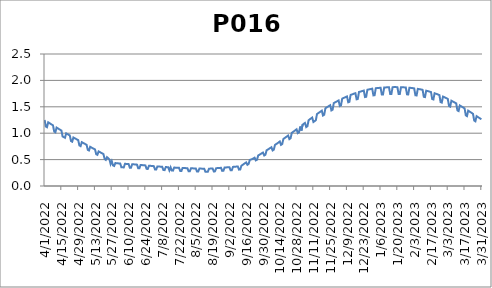
| Category | P016 |
|---|---|
| 4/1/22 | 1.251 |
| 4/2/22 | 1.127 |
| 4/3/22 | 1.114 |
| 4/4/22 | 1.207 |
| 4/5/22 | 1.192 |
| 4/6/22 | 1.177 |
| 4/7/22 | 1.163 |
| 4/8/22 | 1.149 |
| 4/9/22 | 1.03 |
| 4/10/22 | 1.017 |
| 4/11/22 | 1.107 |
| 4/12/22 | 1.092 |
| 4/13/22 | 1.078 |
| 4/14/22 | 1.065 |
| 4/15/22 | 1.051 |
| 4/16/22 | 0.938 |
| 4/17/22 | 0.925 |
| 4/18/22 | 0.913 |
| 4/19/22 | 0.997 |
| 4/20/22 | 0.984 |
| 4/21/22 | 0.97 |
| 4/22/22 | 0.958 |
| 4/23/22 | 0.851 |
| 4/24/22 | 0.839 |
| 4/25/22 | 0.919 |
| 4/26/22 | 0.906 |
| 4/27/22 | 0.893 |
| 4/28/22 | 0.881 |
| 4/29/22 | 0.869 |
| 4/30/22 | 0.768 |
| 5/1/22 | 0.755 |
| 5/2/22 | 0.83 |
| 5/3/22 | 0.818 |
| 5/4/22 | 0.805 |
| 5/5/22 | 0.793 |
| 5/6/22 | 0.78 |
| 5/7/22 | 0.684 |
| 5/8/22 | 0.672 |
| 5/9/22 | 0.742 |
| 5/10/22 | 0.729 |
| 5/11/22 | 0.717 |
| 5/12/22 | 0.705 |
| 5/13/22 | 0.692 |
| 5/14/22 | 0.602 |
| 5/15/22 | 0.59 |
| 5/16/22 | 0.655 |
| 5/17/22 | 0.643 |
| 5/18/22 | 0.63 |
| 5/19/22 | 0.618 |
| 5/20/22 | 0.605 |
| 5/21/22 | 0.515 |
| 5/22/22 | 0.494 |
| 5/23/22 | 0.546 |
| 5/24/22 | 0.526 |
| 5/25/22 | 0.505 |
| 5/26/22 | 0.415 |
| 5/27/22 | 0.471 |
| 5/28/22 | 0.39 |
| 5/29/22 | 0.38 |
| 5/30/22 | 0.435 |
| 5/31/22 | 0.431 |
| 6/1/22 | 0.429 |
| 6/2/22 | 0.428 |
| 6/3/22 | 0.426 |
| 6/4/22 | 0.354 |
| 6/5/22 | 0.353 |
| 6/6/22 | 0.352 |
| 6/7/22 | 0.42 |
| 6/8/22 | 0.419 |
| 6/9/22 | 0.417 |
| 6/10/22 | 0.416 |
| 6/11/22 | 0.347 |
| 6/12/22 | 0.346 |
| 6/13/22 | 0.412 |
| 6/14/22 | 0.41 |
| 6/15/22 | 0.409 |
| 6/16/22 | 0.407 |
| 6/17/22 | 0.405 |
| 6/18/22 | 0.337 |
| 6/19/22 | 0.335 |
| 6/20/22 | 0.398 |
| 6/21/22 | 0.396 |
| 6/22/22 | 0.394 |
| 6/23/22 | 0.392 |
| 6/24/22 | 0.39 |
| 6/25/22 | 0.324 |
| 6/26/22 | 0.323 |
| 6/27/22 | 0.384 |
| 6/28/22 | 0.382 |
| 6/29/22 | 0.38 |
| 6/30/22 | 0.378 |
| 7/1/22 | 0.376 |
| 7/2/22 | 0.313 |
| 7/3/22 | 0.311 |
| 7/4/22 | 0.371 |
| 7/5/22 | 0.369 |
| 7/6/22 | 0.367 |
| 7/7/22 | 0.366 |
| 7/8/22 | 0.364 |
| 7/9/22 | 0.302 |
| 7/10/22 | 0.301 |
| 7/11/22 | 0.359 |
| 7/12/22 | 0.357 |
| 7/13/22 | 0.356 |
| 7/14/22 | 0.295 |
| 7/15/22 | 0.353 |
| 7/16/22 | 0.292 |
| 7/17/22 | 0.291 |
| 7/18/22 | 0.349 |
| 7/19/22 | 0.348 |
| 7/20/22 | 0.347 |
| 7/21/22 | 0.345 |
| 7/22/22 | 0.344 |
| 7/23/22 | 0.285 |
| 7/24/22 | 0.284 |
| 7/25/22 | 0.341 |
| 7/26/22 | 0.34 |
| 7/27/22 | 0.339 |
| 7/28/22 | 0.338 |
| 7/29/22 | 0.337 |
| 7/30/22 | 0.278 |
| 7/31/22 | 0.278 |
| 8/1/22 | 0.335 |
| 8/2/22 | 0.334 |
| 8/3/22 | 0.334 |
| 8/4/22 | 0.333 |
| 8/5/22 | 0.332 |
| 8/6/22 | 0.274 |
| 8/7/22 | 0.273 |
| 8/8/22 | 0.33 |
| 8/9/22 | 0.33 |
| 8/10/22 | 0.329 |
| 8/11/22 | 0.328 |
| 8/12/22 | 0.328 |
| 8/13/22 | 0.269 |
| 8/14/22 | 0.269 |
| 8/15/22 | 0.268 |
| 8/16/22 | 0.328 |
| 8/17/22 | 0.329 |
| 8/18/22 | 0.331 |
| 8/19/22 | 0.332 |
| 8/20/22 | 0.276 |
| 8/21/22 | 0.277 |
| 8/22/22 | 0.337 |
| 8/23/22 | 0.339 |
| 8/24/22 | 0.341 |
| 8/25/22 | 0.342 |
| 8/26/22 | 0.344 |
| 8/27/22 | 0.287 |
| 8/28/22 | 0.288 |
| 8/29/22 | 0.35 |
| 8/30/22 | 0.351 |
| 8/31/22 | 0.353 |
| 9/1/22 | 0.354 |
| 9/2/22 | 0.356 |
| 9/3/22 | 0.297 |
| 9/4/22 | 0.299 |
| 9/5/22 | 0.362 |
| 9/6/22 | 0.364 |
| 9/7/22 | 0.366 |
| 9/8/22 | 0.368 |
| 9/9/22 | 0.37 |
| 9/10/22 | 0.31 |
| 9/11/22 | 0.312 |
| 9/12/22 | 0.383 |
| 9/13/22 | 0.4 |
| 9/14/22 | 0.416 |
| 9/15/22 | 0.433 |
| 9/16/22 | 0.447 |
| 9/17/22 | 0.401 |
| 9/18/22 | 0.417 |
| 9/19/22 | 0.494 |
| 9/20/22 | 0.502 |
| 9/21/22 | 0.51 |
| 9/22/22 | 0.522 |
| 9/23/22 | 0.536 |
| 9/24/22 | 0.485 |
| 9/25/22 | 0.498 |
| 9/26/22 | 0.578 |
| 9/27/22 | 0.592 |
| 9/28/22 | 0.606 |
| 9/29/22 | 0.62 |
| 9/30/22 | 0.633 |
| 10/1/22 | 0.578 |
| 10/2/22 | 0.591 |
| 10/3/22 | 0.676 |
| 10/4/22 | 0.69 |
| 10/5/22 | 0.704 |
| 10/6/22 | 0.719 |
| 10/7/22 | 0.734 |
| 10/8/22 | 0.673 |
| 10/9/22 | 0.687 |
| 10/10/22 | 0.778 |
| 10/11/22 | 0.794 |
| 10/12/22 | 0.809 |
| 10/13/22 | 0.826 |
| 10/14/22 | 0.843 |
| 10/15/22 | 0.779 |
| 10/16/22 | 0.794 |
| 10/17/22 | 0.891 |
| 10/18/22 | 0.907 |
| 10/19/22 | 0.924 |
| 10/20/22 | 0.94 |
| 10/21/22 | 0.956 |
| 10/22/22 | 0.888 |
| 10/23/22 | 0.904 |
| 10/24/22 | 1.007 |
| 10/25/22 | 1.024 |
| 10/26/22 | 1.04 |
| 10/27/22 | 1.058 |
| 10/28/22 | 1.074 |
| 10/29/22 | 1.001 |
| 10/30/22 | 1.018 |
| 10/31/22 | 1.126 |
| 11/1/22 | 1.051 |
| 11/2/22 | 1.16 |
| 11/3/22 | 1.178 |
| 11/4/22 | 1.194 |
| 11/5/22 | 1.116 |
| 11/6/22 | 1.132 |
| 11/7/22 | 1.246 |
| 11/8/22 | 1.263 |
| 11/9/22 | 1.28 |
| 11/10/22 | 1.297 |
| 11/11/22 | 1.212 |
| 11/12/22 | 1.228 |
| 11/13/22 | 1.244 |
| 11/14/22 | 1.362 |
| 11/15/22 | 1.379 |
| 11/16/22 | 1.395 |
| 11/17/22 | 1.411 |
| 11/18/22 | 1.427 |
| 11/19/22 | 1.335 |
| 11/20/22 | 1.35 |
| 11/21/22 | 1.472 |
| 11/22/22 | 1.487 |
| 11/23/22 | 1.501 |
| 11/24/22 | 1.516 |
| 11/25/22 | 1.53 |
| 11/26/22 | 1.431 |
| 11/27/22 | 1.444 |
| 11/28/22 | 1.571 |
| 11/29/22 | 1.583 |
| 11/30/22 | 1.595 |
| 12/1/22 | 1.608 |
| 12/2/22 | 1.62 |
| 12/3/22 | 1.516 |
| 12/4/22 | 1.527 |
| 12/5/22 | 1.655 |
| 12/6/22 | 1.665 |
| 12/7/22 | 1.676 |
| 12/8/22 | 1.686 |
| 12/9/22 | 1.697 |
| 12/10/22 | 1.585 |
| 12/11/22 | 1.594 |
| 12/12/22 | 1.725 |
| 12/13/22 | 1.733 |
| 12/14/22 | 1.741 |
| 12/15/22 | 1.751 |
| 12/16/22 | 1.758 |
| 12/17/22 | 1.642 |
| 12/18/22 | 1.648 |
| 12/19/22 | 1.781 |
| 12/20/22 | 1.787 |
| 12/21/22 | 1.794 |
| 12/22/22 | 1.8 |
| 12/23/22 | 1.807 |
| 12/24/22 | 1.685 |
| 12/25/22 | 1.69 |
| 12/26/22 | 1.823 |
| 12/27/22 | 1.828 |
| 12/28/22 | 1.833 |
| 12/29/22 | 1.837 |
| 12/30/22 | 1.843 |
| 12/31/22 | 1.716 |
| 1/1/23 | 1.719 |
| 1/2/23 | 1.851 |
| 1/3/23 | 1.855 |
| 1/4/23 | 1.857 |
| 1/5/23 | 1.859 |
| 1/6/23 | 1.861 |
| 1/7/23 | 1.733 |
| 1/8/23 | 1.734 |
| 1/9/23 | 1.866 |
| 1/10/23 | 1.867 |
| 1/11/23 | 1.868 |
| 1/12/23 | 1.869 |
| 1/13/23 | 1.871 |
| 1/14/23 | 1.742 |
| 1/15/23 | 1.742 |
| 1/16/23 | 1.872 |
| 1/17/23 | 1.873 |
| 1/18/23 | 1.873 |
| 1/19/23 | 1.873 |
| 1/20/23 | 1.872 |
| 1/21/23 | 1.743 |
| 1/22/23 | 1.742 |
| 1/23/23 | 1.871 |
| 1/24/23 | 1.87 |
| 1/25/23 | 1.869 |
| 1/26/23 | 1.868 |
| 1/27/23 | 1.866 |
| 1/28/23 | 1.736 |
| 1/29/23 | 1.734 |
| 1/30/23 | 1.861 |
| 1/31/23 | 1.859 |
| 2/1/23 | 1.856 |
| 2/2/23 | 1.853 |
| 2/3/23 | 1.849 |
| 2/4/23 | 1.718 |
| 2/5/23 | 1.715 |
| 2/6/23 | 1.839 |
| 2/7/23 | 1.835 |
| 2/8/23 | 1.831 |
| 2/9/23 | 1.826 |
| 2/10/23 | 1.822 |
| 2/11/23 | 1.689 |
| 2/12/23 | 1.684 |
| 2/13/23 | 1.804 |
| 2/14/23 | 1.799 |
| 2/15/23 | 1.794 |
| 2/16/23 | 1.787 |
| 2/17/23 | 1.779 |
| 2/18/23 | 1.646 |
| 2/19/23 | 1.639 |
| 2/20/23 | 1.757 |
| 2/21/23 | 1.749 |
| 2/22/23 | 1.741 |
| 2/23/23 | 1.731 |
| 2/24/23 | 1.722 |
| 2/25/23 | 1.588 |
| 2/26/23 | 1.579 |
| 2/27/23 | 1.694 |
| 2/28/23 | 1.683 |
| 3/1/23 | 1.672 |
| 3/2/23 | 1.662 |
| 3/3/23 | 1.65 |
| 3/4/23 | 1.517 |
| 3/5/23 | 1.504 |
| 3/6/23 | 1.616 |
| 3/7/23 | 1.603 |
| 3/8/23 | 1.591 |
| 3/9/23 | 1.578 |
| 3/10/23 | 1.565 |
| 3/11/23 | 1.432 |
| 3/12/23 | 1.42 |
| 3/13/23 | 1.525 |
| 3/14/23 | 1.512 |
| 3/15/23 | 1.497 |
| 3/16/23 | 1.484 |
| 3/17/23 | 1.47 |
| 3/18/23 | 1.338 |
| 3/19/23 | 1.324 |
| 3/20/23 | 1.427 |
| 3/21/23 | 1.412 |
| 3/22/23 | 1.397 |
| 3/23/23 | 1.383 |
| 3/24/23 | 1.367 |
| 3/25/23 | 1.24 |
| 3/26/23 | 1.225 |
| 3/27/23 | 1.323 |
| 3/28/23 | 1.308 |
| 3/29/23 | 1.292 |
| 3/30/23 | 1.278 |
| 3/31/23 | 1.263 |